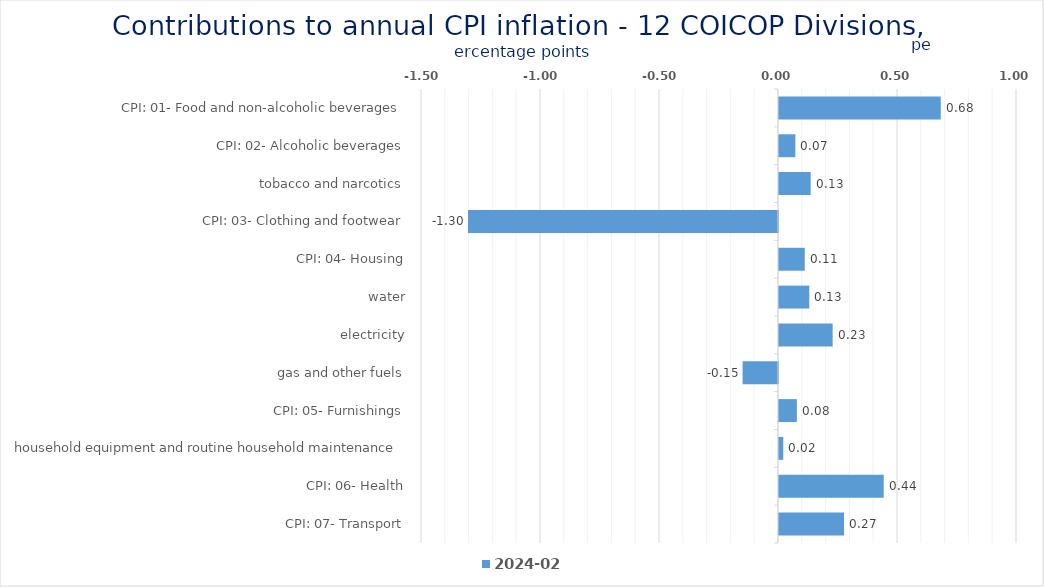
| Category | 2024-02 |
|---|---|
| CPI: 01- Food and non-alcoholic beverages | 0.68 |
| CPI: 02- Alcoholic beverages, tobacco and narcotics | 0.069 |
| CPI: 03- Clothing and footwear | 0.133 |
| CPI: 04- Housing, water, electricity, gas and other fuels | -1.303 |
| CPI: 05- Furnishings, household equipment and routine household maintenance | 0.108 |
| CPI: 06- Health | 0.127 |
| CPI: 07- Transport | 0.225 |
| CPI: 08- Communication | -0.149 |
| CPI: 09- Recreation and culture | 0.075 |
| CPI: 10- Education | 0.018 |
| CPI: 11- Restaurants and hotels | 0.44 |
| CPI: 12- Miscellaneous goods and services | 0.273 |